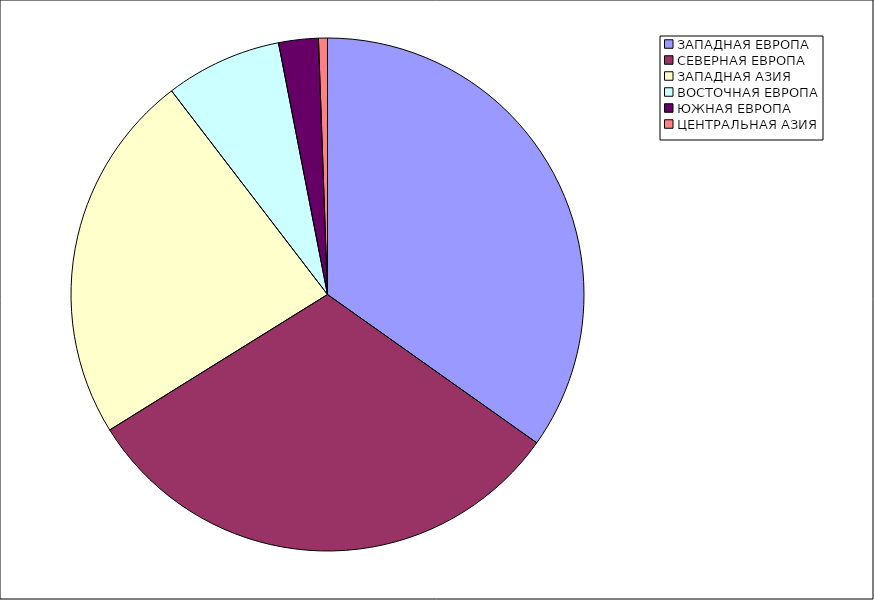
| Category | Оборот |
|---|---|
| ЗАПАДНАЯ ЕВРОПА | 34.813 |
| СЕВЕРНАЯ ЕВРОПА | 31.331 |
| ЗАПАДНАЯ АЗИЯ | 23.454 |
| ВОСТОЧНАЯ ЕВРОПА | 7.339 |
| ЮЖНАЯ ЕВРОПА | 2.499 |
| ЦЕНТРАЛЬНАЯ АЗИЯ | 0.564 |